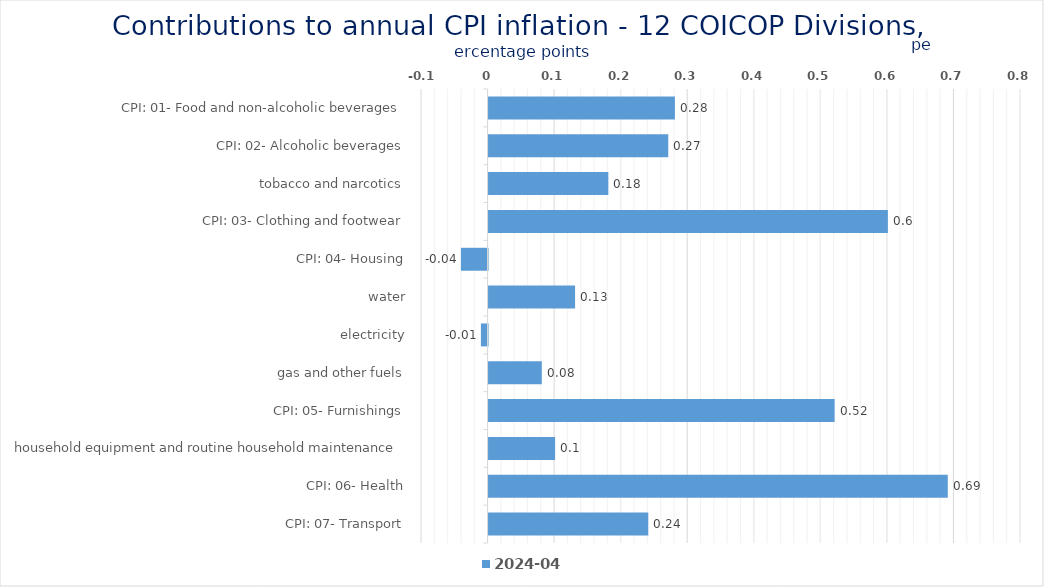
| Category | 2024-04 |
|---|---|
| CPI: 01- Food and non-alcoholic beverages | 0.28 |
| CPI: 02- Alcoholic beverages, tobacco and narcotics | 0.27 |
| CPI: 03- Clothing and footwear | 0.18 |
| CPI: 04- Housing, water, electricity, gas and other fuels | 0.6 |
| CPI: 05- Furnishings, household equipment and routine household maintenance | -0.04 |
| CPI: 06- Health | 0.13 |
| CPI: 07- Transport | -0.01 |
| CPI: 08- Communication | 0.08 |
| CPI: 09- Recreation and culture | 0.52 |
| CPI: 10- Education | 0.1 |
| CPI: 11- Restaurants and hotels | 0.69 |
| CPI: 12- Miscellaneous goods and services | 0.24 |